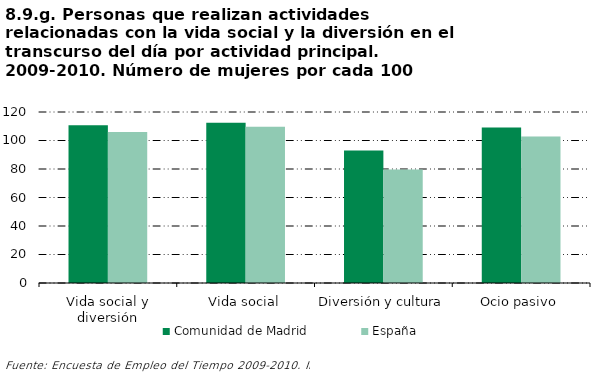
| Category | Comunidad de Madrid | España |
|---|---|---|
| Vida social y diversión | 110.617 | 105.893 |
| Vida social | 112.398 | 109.592 |
| Diversión y cultura | 93.044 | 79.592 |
| Ocio pasivo | 109.198 | 102.791 |